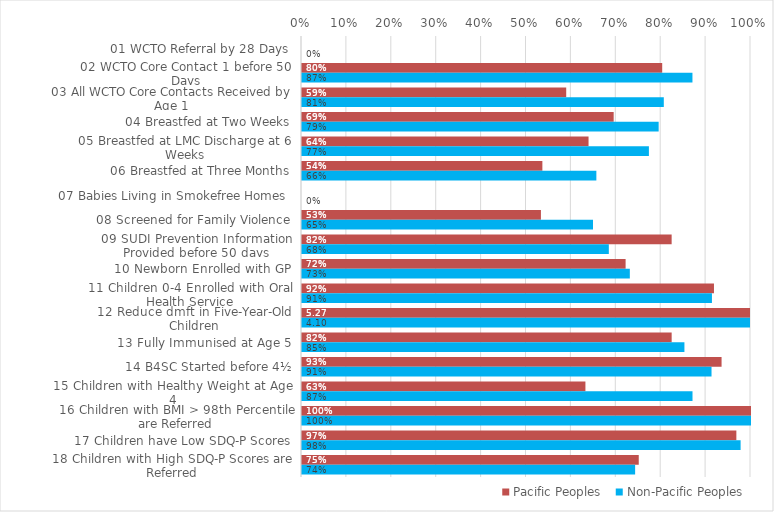
| Category | Pacific Peoples | Non-Pacific Peoples |
|---|---|---|
| 01 WCTO Referral by 28 Days | 0 | 0 |
| 02 WCTO Core Contact 1 before 50 Days | 0.802 | 0.87 |
| 03 All WCTO Core Contacts Received by Age 1 | 0.588 | 0.806 |
| 04 Breastfed at Two Weeks | 0.694 | 0.794 |
| 05 Breastfed at LMC Discharge at 6 Weeks | 0.638 | 0.773 |
| 06 Breastfed at Three Months | 0.535 | 0.656 |
| 07 Babies Living in Smokefree Homes  | 0 | 0 |
| 08 Screened for Family Violence | 0.532 | 0.648 |
| 09 SUDI Prevention Information Provided before 50 days | 0.823 | 0.683 |
| 10 Newborn Enrolled with GP | 0.721 | 0.73 |
| 11 Children 0-4 Enrolled with Oral Health Service | 0.918 | 0.913 |
| 12 Reduce dmft in Five-Year-Old Children | 5.267 | 4.096 |
| 13 Fully Immunised at Age 5 | 0.823 | 0.852 |
| 14 B4SC Started before 4½ | 0.934 | 0.912 |
| 15 Children with Healthy Weight at Age 4 | 0.631 | 0.87 |
| 16 Children with BMI > 98th Percentile are Referred | 1 | 1 |
| 17 Children have Low SDQ-P Scores | 0.967 | 0.977 |
| 18 Children with High SDQ-P Scores are Referred | 0.75 | 0.742 |